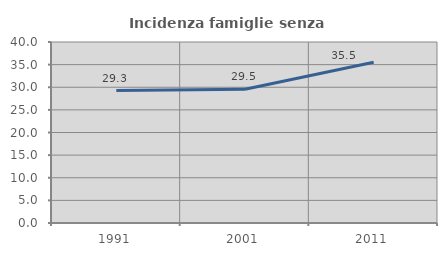
| Category | Incidenza famiglie senza nuclei |
|---|---|
| 1991.0 | 29.258 |
| 2001.0 | 29.545 |
| 2011.0 | 35.509 |